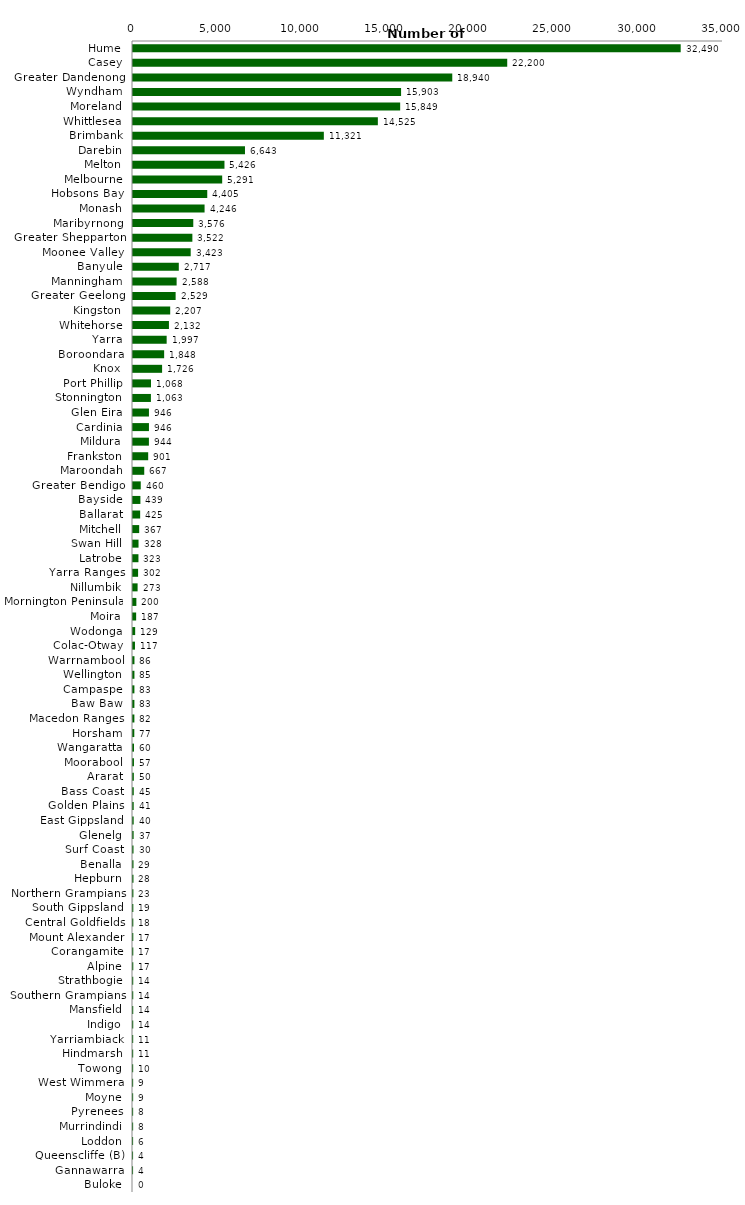
| Category | Series 0 |
|---|---|
| Hume | 32490 |
| Casey | 22200 |
| Greater Dandenong | 18940 |
| Wyndham | 15903 |
| Moreland | 15849 |
| Whittlesea | 14525 |
| Brimbank | 11321 |
| Darebin | 6643 |
| Melton | 5426 |
| Melbourne | 5291 |
| Hobsons Bay | 4405 |
| Monash | 4246 |
| Maribyrnong | 3576 |
| Greater Shepparton | 3522 |
| Moonee Valley | 3423 |
| Banyule | 2717 |
| Manningham | 2588 |
| Greater Geelong | 2529 |
| Kingston | 2207 |
| Whitehorse | 2132 |
| Yarra | 1997 |
| Boroondara | 1848 |
| Knox | 1726 |
| Port Phillip | 1068 |
| Stonnington | 1063 |
| Glen Eira | 946 |
| Cardinia | 946 |
| Mildura | 944 |
| Frankston | 901 |
| Maroondah | 667 |
| Greater Bendigo | 460 |
| Bayside | 439 |
| Ballarat | 425 |
| Mitchell | 367 |
| Swan Hill | 328 |
| Latrobe | 323 |
| Yarra Ranges | 302 |
| Nillumbik | 273 |
| Mornington Peninsula | 200 |
| Moira | 187 |
| Wodonga | 129 |
| Colac-Otway | 117 |
| Warrnambool | 86 |
| Wellington | 85 |
| Campaspe | 83 |
| Baw Baw | 83 |
| Macedon Ranges | 82 |
| Horsham | 77 |
| Wangaratta | 60 |
| Moorabool | 57 |
| Ararat | 50 |
| Bass Coast | 45 |
| Golden Plains | 41 |
| East Gippsland | 40 |
| Glenelg | 37 |
| Surf Coast | 30 |
| Benalla | 29 |
| Hepburn | 28 |
| Northern Grampians | 23 |
| South Gippsland | 19 |
| Central Goldfields | 18 |
| Mount Alexander | 17 |
| Corangamite | 17 |
| Alpine | 17 |
| Strathbogie | 14 |
| Southern Grampians | 14 |
| Mansfield | 14 |
| Indigo | 14 |
| Yarriambiack | 11 |
| Hindmarsh | 11 |
| Towong | 10 |
| West Wimmera | 9 |
| Moyne | 9 |
| Pyrenees | 8 |
| Murrindindi | 8 |
| Loddon | 6 |
| Queenscliffe (B) | 4 |
| Gannawarra | 4 |
| Buloke | 0 |